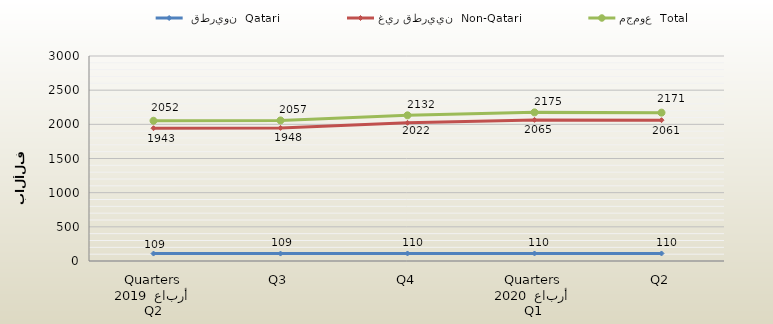
| Category |  قطريون  Qatari | غير قطريين  Non-Qatari | مجموع  Total |
|---|---|---|---|
| 0 | 109 | 1943 | 2052 |
| 1 | 109 | 1948 | 2057 |
| 2 | 110 | 2022 | 2132 |
| 3 | 110 | 2065 | 2175 |
| 4 | 110 | 2061 | 2171 |